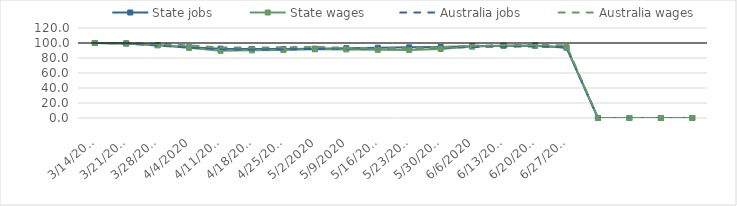
| Category | State jobs | State wages | Australia jobs | Australia wages |
|---|---|---|---|---|
| 14/03/2020 | 100 | 100 | 100 | 100 |
| 21/03/2020 | 99.563 | 99.083 | 99.389 | 100.07 |
| 28/03/2020 | 96.933 | 97.347 | 96.608 | 98.707 |
| 04/04/2020 | 94.238 | 93.529 | 93.828 | 96.765 |
| 11/04/2020 | 92.491 | 89.518 | 91.887 | 94.047 |
| 18/04/2020 | 91.9 | 90.184 | 91.31 | 93.932 |
| 25/04/2020 | 91.849 | 90.691 | 91.6 | 94.326 |
| 02/05/2020 | 92.426 | 91.574 | 91.954 | 94.889 |
| 09/05/2020 | 93.083 | 91.439 | 92.449 | 93.491 |
| 16/05/2020 | 93.693 | 90.845 | 92.97 | 93.144 |
| 23/05/2020 | 94.179 | 90.668 | 93.251 | 92.924 |
| 30/05/2020 | 94.613 | 92.06 | 93.813 | 94.361 |
| 06/06/2020 | 95.66 | 95.167 | 94.668 | 96.401 |
| 13/06/2020 | 96.486 | 96.203 | 95.11 | 97.158 |
| 20/06/2020 | 96.702 | 96.112 | 95.246 | 97.537 |
| 27/06/2020 | 93.757 | 94.603 | 94.328 | 96.826 |